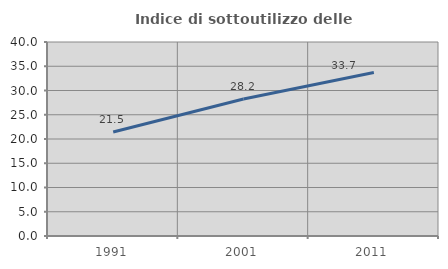
| Category | Indice di sottoutilizzo delle abitazioni  |
|---|---|
| 1991.0 | 21.457 |
| 2001.0 | 28.249 |
| 2011.0 | 33.708 |